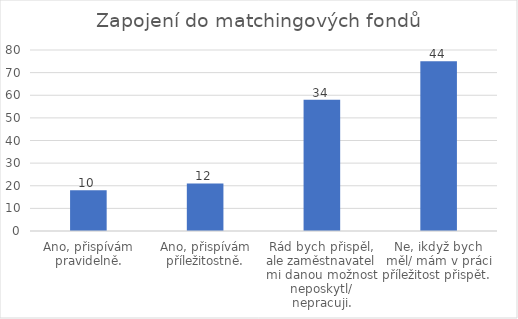
| Category | Počet respondentů |
|---|---|
| Ano, přispívám pravidelně. | 18 |
| Ano, přispívám příležitostně. | 21 |
| Rád bych přispěl, ale zaměstnavatel mi danou možnost neposkytl/ nepracuji. | 58 |
| Ne, ikdyž bych měl/ mám v práci příležitost přispět.  | 75 |